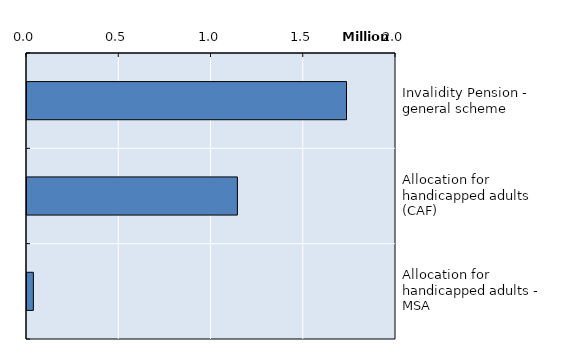
| Category | Series 0 |
|---|---|
| Invalidity Pension - general scheme | 1731786 |
| Allocation for handicapped adults (CAF) | 1140385.75 |
| Allocation for handicapped adults - MSA | 34627 |